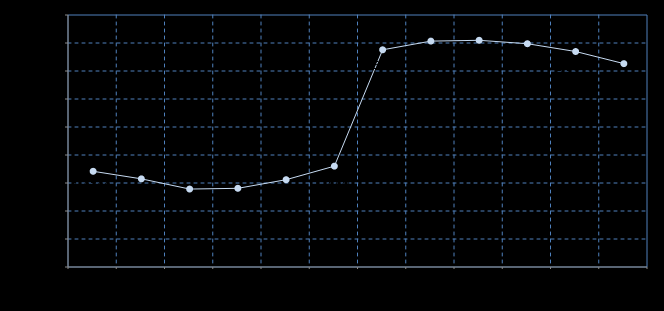
| Category | Series 0 |
|---|---|
| Oct 15 | 1.371 |
| Nov 15 | 1.357 |
| Dec 15 | 1.339 |
| Jan 16 | 1.34 |
| Feb 16 | 1.356 |
| Mar 16 | 1.38 |
| Apr 16 | 1.588 |
| May 16 | 1.603 |
| Jun 16 | 1.605 |
| Jul 16 | 1.599 |
| Aug 16 | 1.585 |
| Sep 16 | 1.563 |